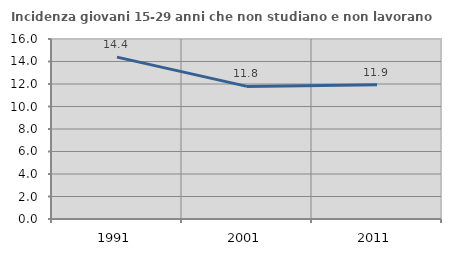
| Category | Incidenza giovani 15-29 anni che non studiano e non lavorano  |
|---|---|
| 1991.0 | 14.391 |
| 2001.0 | 11.786 |
| 2011.0 | 11.93 |